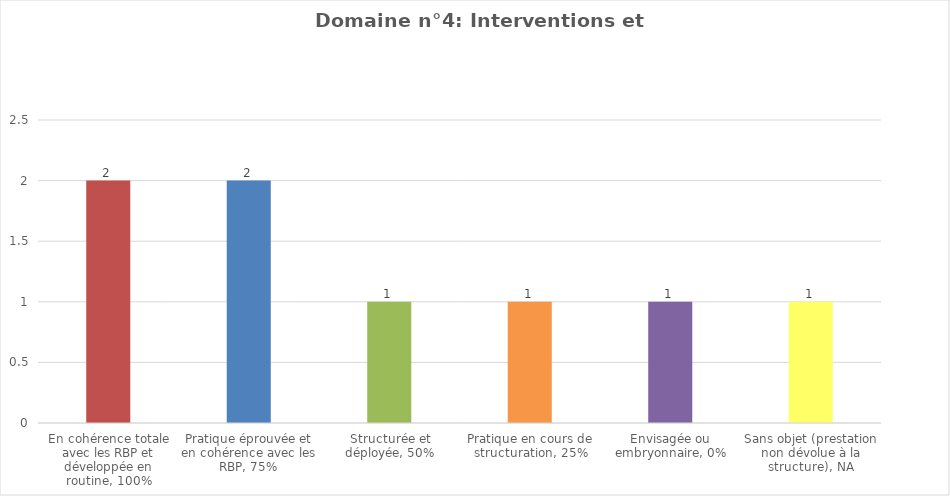
| Category | Domaine n°4: Interventions et apprentissages |
|---|---|
| En cohérence totale avec les RBP et développée en routine, 100% | 2 |
| Pratique éprouvée et en cohérence avec les RBP, 75% | 2 |
| Structurée et déployée, 50% | 1 |
| Pratique en cours de structuration, 25% | 1 |
| Envisagée ou embryonnaire, 0% | 1 |
| Sans objet (prestation non dévolue à la structure), NA | 1 |